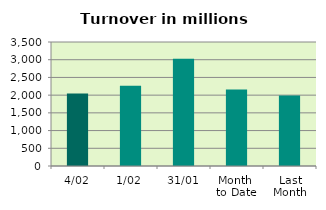
| Category | Series 0 |
|---|---|
| 4/02 | 2049.201 |
| 1/02 | 2267.407 |
| 31/01 | 3028.819 |
| Month 
to Date | 2158.304 |
| Last
Month | 1988.014 |